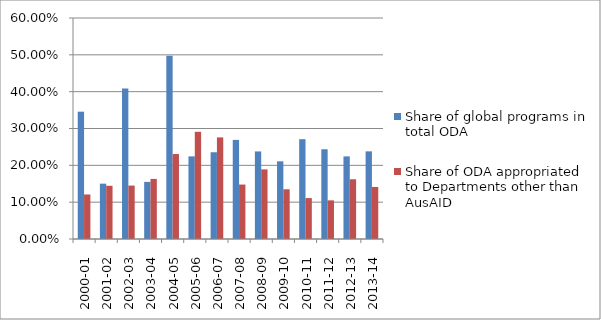
| Category | Share of global programs in total ODA | Share of ODA appropriated to Departments other than AusAID |
|---|---|---|
| 2000-01 | 0.346 | 0.121 |
| 2001-02 | 0.15 | 0.144 |
| 2002-03 | 0.409 | 0.145 |
| 2003-04 | 0.155 | 0.163 |
| 2004-05 | 0.498 | 0.231 |
| 2005-06 | 0.224 | 0.291 |
| 2006-07 | 0.236 | 0.276 |
| 2007-08 | 0.269 | 0.148 |
| 2008-09 | 0.238 | 0.189 |
| 2009-10 | 0.211 | 0.135 |
| 2010-11 | 0.271 | 0.111 |
| 2011-12 | 0.244 | 0.105 |
| 2012-13 | 0.224 | 0.162 |
| 2013-14 | 0.238 | 0.141 |